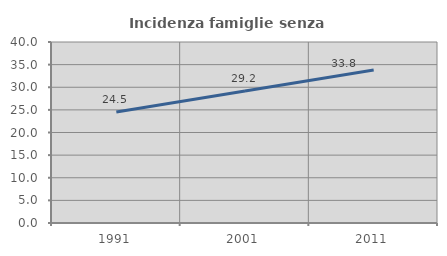
| Category | Incidenza famiglie senza nuclei |
|---|---|
| 1991.0 | 24.537 |
| 2001.0 | 29.167 |
| 2011.0 | 33.79 |